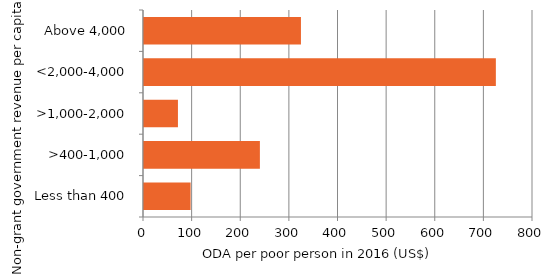
| Category | Series 0 |
|---|---|
| Less than 400 | 95.855 |
| >400-1,000 | 238.343 |
| >1,000-2,000 | 69.807 |
| <2,000-4,000 | 723.624 |
| Above 4,000 | 322.775 |